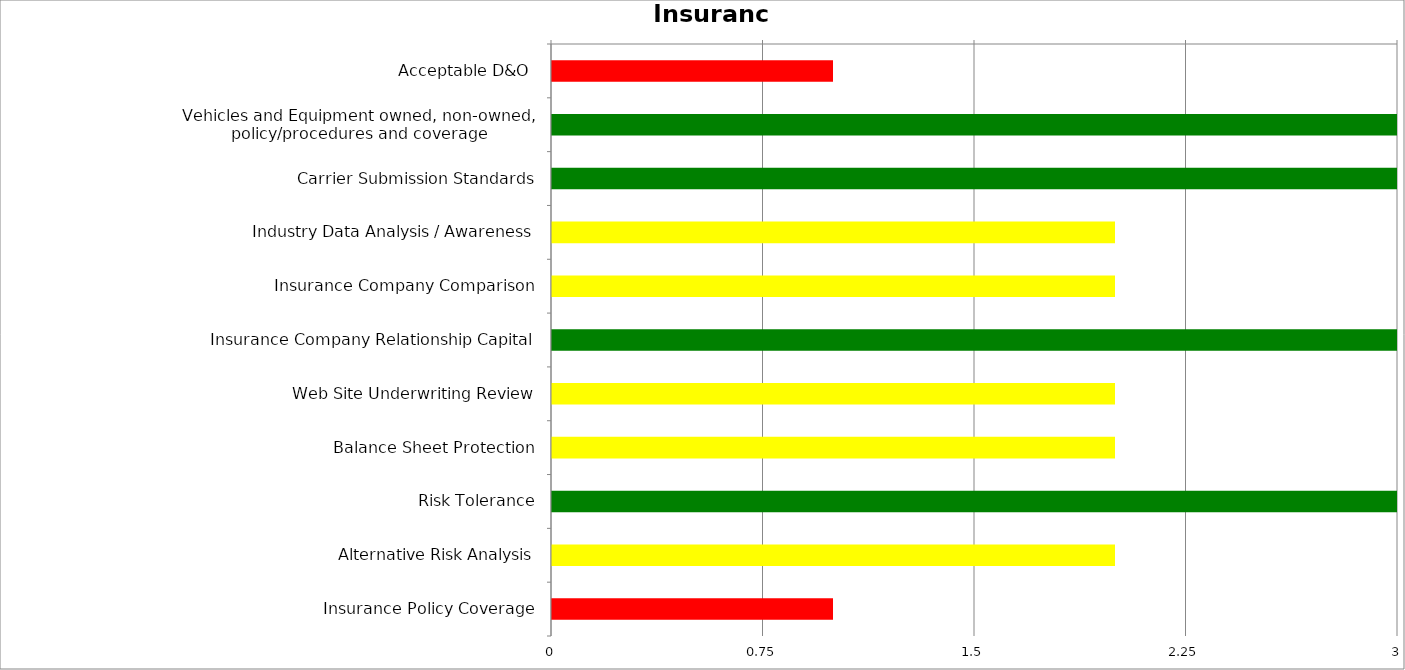
| Category | Low | Medium | High |
|---|---|---|---|
| Acceptable D&O  | 0 | 0 | 1 |
| Vehicles and Equipment owned, non-owned, policy/procedures and coverage | 3 | 0 | 0 |
| Carrier Submission Standards | 3 | 0 | 0 |
| Industry Data Analysis / Awareness | 0 | 2 | 0 |
| Insurance Company Comparison | 0 | 2 | 0 |
| Insurance Company Relationship Capital | 3 | 0 | 0 |
| Web Site Underwriting Review | 0 | 2 | 0 |
| Balance Sheet Protection | 0 | 2 | 0 |
| Risk Tolerance | 3 | 0 | 0 |
| Alternative Risk Analysis | 0 | 2 | 0 |
| Insurance Policy Coverage | 0 | 0 | 1 |